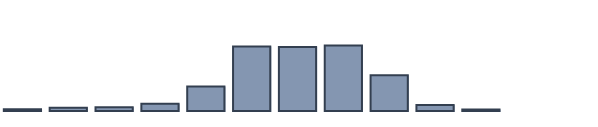
| Category | Series 0 |
|---|---|
| 0 | 0.606 |
| 1 | 1.212 |
| 2 | 1.364 |
| 3 | 2.576 |
| 4 | 8.788 |
| 5 | 23.258 |
| 6 | 23.106 |
| 7 | 23.561 |
| 8 | 12.879 |
| 9 | 2.121 |
| 10 | 0.53 |
| 11 | 0 |
| 12 | 0 |